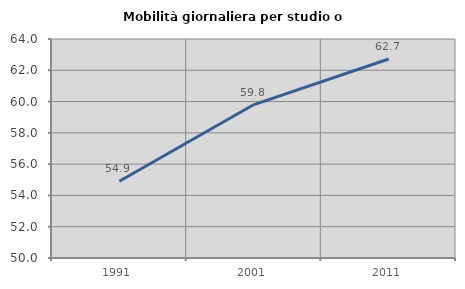
| Category | Mobilità giornaliera per studio o lavoro |
|---|---|
| 1991.0 | 54.902 |
| 2001.0 | 59.809 |
| 2011.0 | 62.722 |